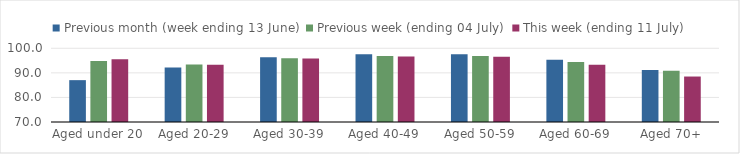
| Category | Previous month (week ending 13 June) | Previous week (ending 04 July) | This week (ending 11 July) |
|---|---|---|---|
| Aged under 20 | 87.035 | 94.875 | 95.497 |
| Aged 20-29 | 92.135 | 93.373 | 93.323 |
| Aged 30-39 | 96.397 | 95.942 | 95.872 |
| Aged 40-49 | 97.562 | 96.844 | 96.695 |
| Aged 50-59 | 97.599 | 96.898 | 96.549 |
| Aged 60-69 | 95.338 | 94.453 | 93.277 |
| Aged 70+ | 91.169 | 90.844 | 88.507 |